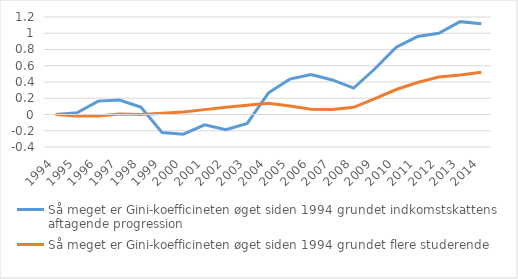
| Category | Så meget er Gini-koefficineten øget siden 1994 grundet indkomstskattens aftagende progression | Så meget er Gini-koefficineten øget siden 1994 grundet flere studerende |
|---|---|---|
| 1994.0 | 0 | 0 |
| 1995.0 | 0.022 | -0.02 |
| 1996.0 | 0.165 | -0.02 |
| 1997.0 | 0.179 | 0.005 |
| 1998.0 | 0.093 | -0.001 |
| 1999.0 | -0.223 | 0.016 |
| 2000.0 | -0.242 | 0.031 |
| 2001.0 | -0.127 | 0.06 |
| 2002.0 | -0.188 | 0.088 |
| 2003.0 | -0.11 | 0.114 |
| 2004.0 | 0.267 | 0.137 |
| 2005.0 | 0.435 | 0.104 |
| 2006.0 | 0.491 | 0.066 |
| 2007.0 | 0.426 | 0.061 |
| 2008.0 | 0.325 | 0.089 |
| 2009.0 | 0.563 | 0.196 |
| 2010.0 | 0.828 | 0.308 |
| 2011.0 | 0.959 | 0.394 |
| 2012.0 | 1 | 0.461 |
| 2013.0 | 1.143 | 0.486 |
| 2014.0 | 1.117 | 0.52 |